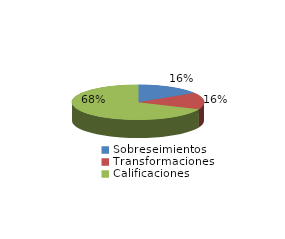
| Category | Series 0 |
|---|---|
| Sobreseimientos | 67 |
| Transformaciones | 65 |
| Calificaciones | 286 |